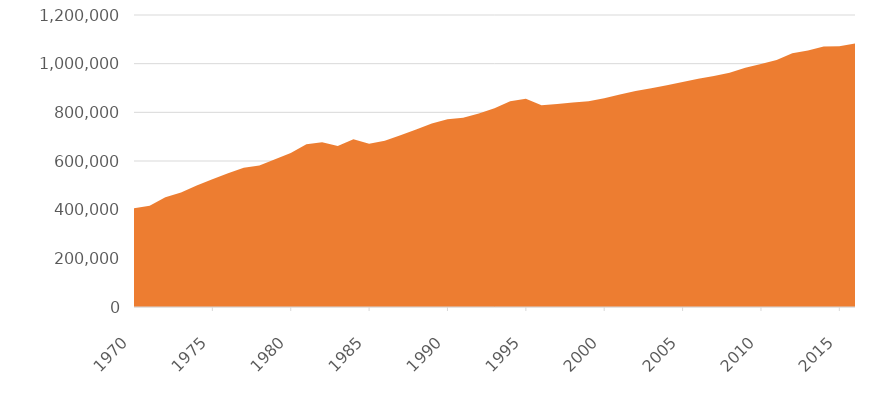
| Category | Restrictions |
|---|---|
| 1970.0 | 405647 |
| 1971.0 | 416471 |
| 1972.0 | 451342 |
| 1973.0 | 470514 |
| 1974.0 | 499759 |
| 1975.0 | 524561 |
| 1976.0 | 549182 |
| 1977.0 | 571769 |
| 1978.0 | 581824 |
| 1979.0 | 607336 |
| 1980.0 | 633106 |
| 1981.0 | 668890 |
| 1982.0 | 676909 |
| 1983.0 | 662099 |
| 1984.0 | 688904 |
| 1985.0 | 671357 |
| 1986.0 | 683677 |
| 1987.0 | 705789 |
| 1988.0 | 729638 |
| 1989.0 | 753840 |
| 1990.0 | 771860 |
| 1991.0 | 777524 |
| 1992.0 | 795652 |
| 1993.0 | 817092 |
| 1994.0 | 845588 |
| 1995.0 | 855840 |
| 1996.0 | 828827 |
| 1997.0 | 833866 |
| 1998.0 | 840466 |
| 1999.0 | 845798 |
| 2000.0 | 857793 |
| 2001.0 | 873541 |
| 2002.0 | 887464 |
| 2003.0 | 898575 |
| 2004.0 | 911233 |
| 2005.0 | 924991 |
| 2006.0 | 938086 |
| 2007.0 | 948934 |
| 2008.0 | 962932 |
| 2009.0 | 983704 |
| 2010.0 | 998514 |
| 2011.0 | 1014838 |
| 2012.0 | 1042361 |
| 2013.0 | 1054023 |
| 2014.0 | 1070677 |
| 2015.0 | 1071228 |
| 2016.0 | 1083318 |